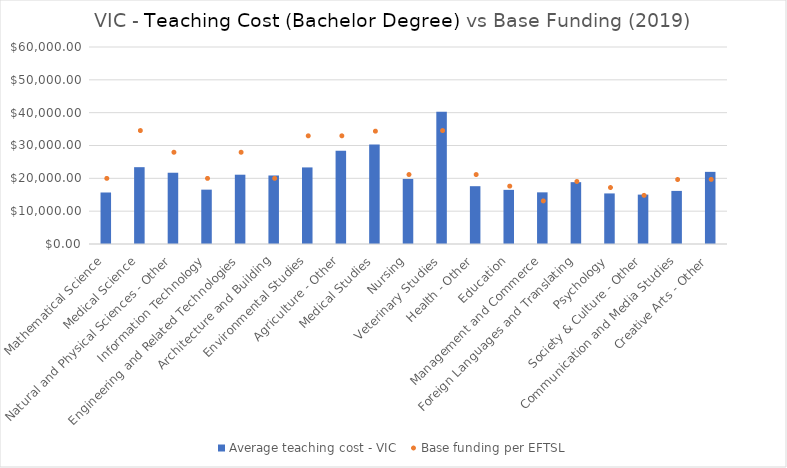
| Category | Average teaching cost - VIC  |
|---|---|
| Mathematical Science | 15687.514 |
| Medical Science | 23398.598 |
| Natural and Physical Sciences - Other | 21703.78 |
| Information Technology | 16553.822 |
| Engineering and Related Technologies | 21104.151 |
| Architecture and Building | 20867.185 |
| Environmental Studies | 23324.745 |
| Agriculture - Other | 28400.801 |
| Medical Studies | 30278.522 |
| Nursing | 19815.93 |
| Veterinary Studies | 40290.399 |
| Health - Other | 17606.753 |
| Education | 16488.824 |
| Management and Commerce | 15733.292 |
| Foreign Languages and Translating | 18833.904 |
| Psychology | 15401.275 |
| Society & Culture - Other | 15041.36 |
| Communication and Media Studies | 16171.985 |
| Creative Arts - Other | 21971.712 |